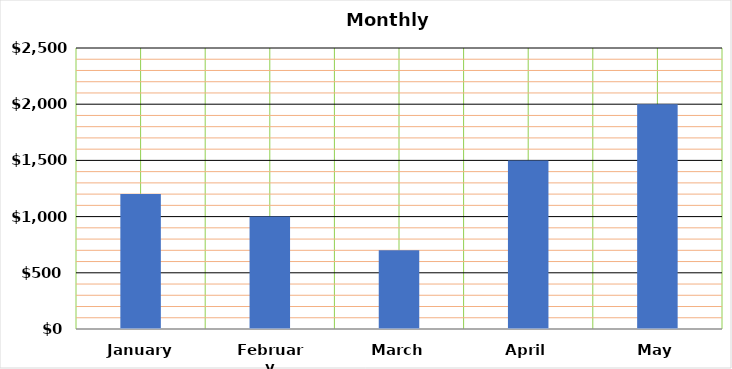
| Category | Profit |
|---|---|
| January | 1200 |
| February | 1000 |
| March | 700 |
| April | 1500 |
| May | 2000 |